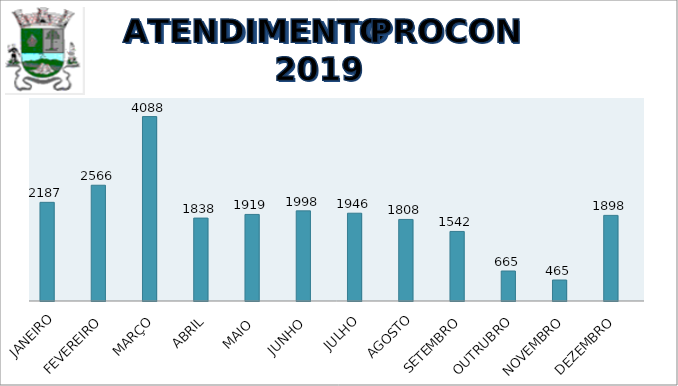
| Category | Series 0 | Series 1 |
|---|---|---|
| JANEIRO | 2187 |  |
| FEVEREIRO | 2566 |  |
| MARÇO | 4088 |  |
| ABRIL | 1838 |  |
| MAIO  | 1919 |  |
| JUNHO  | 1998 |  |
| JULHO | 1946 |  |
| AGOSTO | 1808 |  |
| SETEMBRO | 1542 |  |
| OUTRUBRO | 665 |  |
| NOVEMBRO | 465 |  |
| DEZEMBRO | 1898 |  |